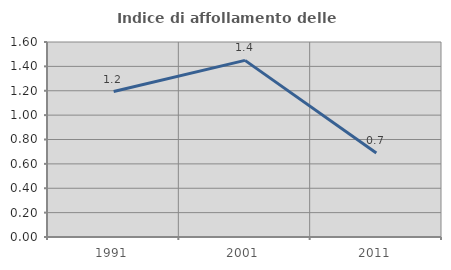
| Category | Indice di affollamento delle abitazioni  |
|---|---|
| 1991.0 | 1.193 |
| 2001.0 | 1.449 |
| 2011.0 | 0.69 |